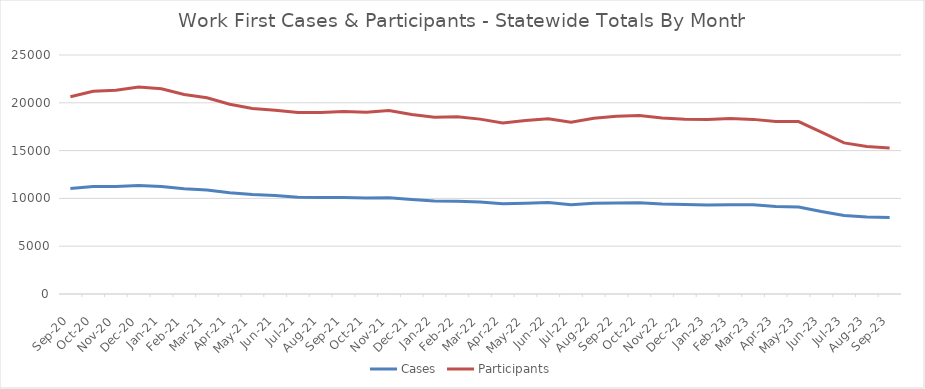
| Category | Cases | Participants |
|---|---|---|
| 2023-09-23 | 7993 | 15261 |
| 2023-08-23 | 8048 | 15431 |
| 2023-07-23 | 8201 | 15804 |
| 2023-06-23 | 8626 | 16926 |
| 2023-05-23 | 9109 | 18037 |
| 2023-04-23 | 9158 | 18032 |
| 2023-03-23 | 9330 | 18266 |
| 2023-02-01 | 9348 | 18367 |
| 2023-01-01 | 9307 | 18258 |
| 2022-12-01 | 9357 | 18283 |
| 2022-11-22 | 9423 | 18412 |
| 2022-10-22 | 9547 | 18673 |
| 2022-09-22 | 9528 | 18586 |
| 2022-08-22 | 9505 | 18379 |
| 2022-07-22 | 9349 | 17973 |
| 2022-06-22 | 9561 | 18334 |
| 2022-05-22 | 9493 | 18139 |
| 2022-04-22 | 9434 | 17898 |
| 2022-03-22 | 9625 | 18293 |
| 2022-02-22 | 9713 | 18537 |
| 2022-01-22 | 9733 | 18484 |
| 2021-12-21 | 9885 | 18776 |
| 2021-11-21 | 10056 | 19192 |
| 2021-10-21 | 10034 | 19005 |
| 2021-09-21 | 10102 | 19085 |
| 2021-08-21 | 10090 | 18974 |
| 2021-07-21 | 10121 | 18988 |
| 2021-06-21 | 10298 | 19211 |
| 2021-05-21 | 10411 | 19413 |
| 2021-04-21 | 10601 | 19845 |
| 2021-03-21 | 10888 | 20521 |
| 2021-02-21 | 11007 | 20877 |
| 2021-01-21 | 11252 | 21466 |
| 2020-12-20 | 11350 | 21641 |
| 2020-11-20 | 11255 | 21305 |
| 2020-10-20 | 11243 | 21198 |
| 2020-09-20 | 11030 | 20626 |